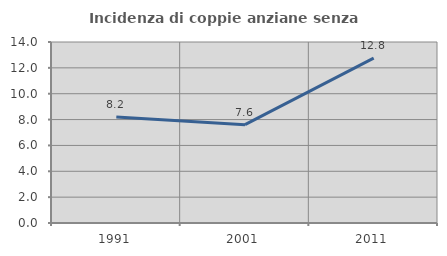
| Category | Incidenza di coppie anziane senza figli  |
|---|---|
| 1991.0 | 8.208 |
| 2001.0 | 7.606 |
| 2011.0 | 12.757 |